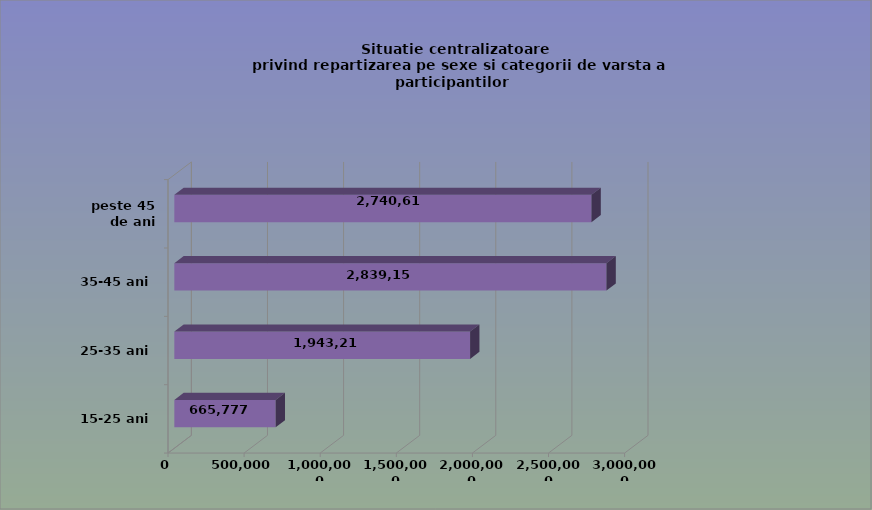
| Category | 15-25 ani 25-35 ani 35-45 ani peste 45 de ani |
|---|---|
| 15-25 ani | 665777 |
| 25-35 ani | 1943218 |
| 35-45 ani | 2839153 |
| peste 45 de ani | 2740610 |